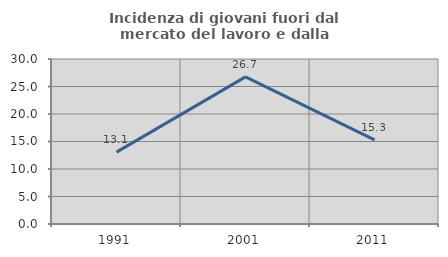
| Category | Incidenza di giovani fuori dal mercato del lavoro e dalla formazione  |
|---|---|
| 1991.0 | 13.065 |
| 2001.0 | 26.744 |
| 2011.0 | 15.278 |